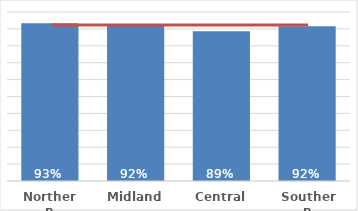
| Category | Pacific |
|---|---|
| Northern | 0.933 |
| Midland | 0.918 |
| Central | 0.887 |
| Southern | 0.916 |